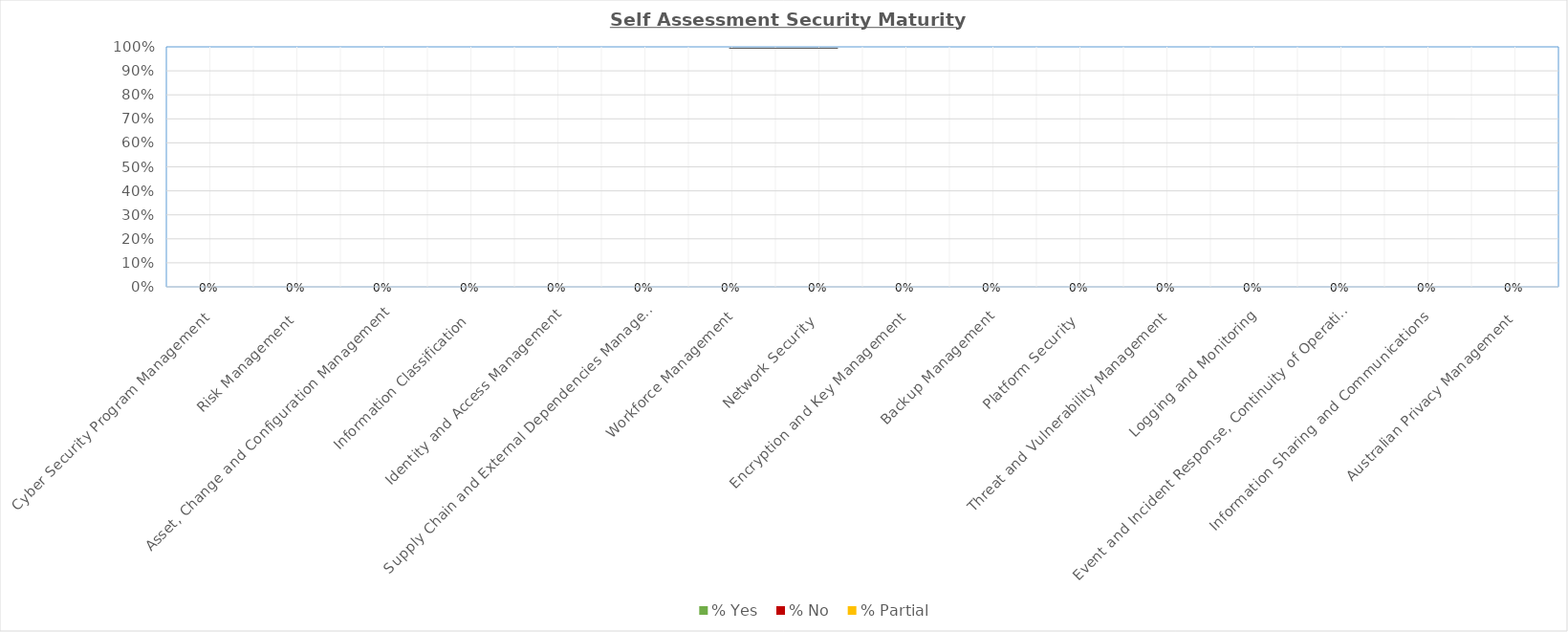
| Category | % Yes | % No | % Partial |
|---|---|---|---|
| Cyber Security Program Management | 0 | 0 | 0 |
| Risk Management | 0 | 0 | 0 |
| Asset, Change and Configuration Management | 0 | 0 | 0 |
| Information Classification | 0 | 0 | 0 |
| Identity and Access Management | 0 | 0 | 0 |
| Supply Chain and External Dependencies Management | 0 | 0 | 0 |
|  Workforce Management | 0 | 0 | 0 |
| Network Security | 0 | 0 | 0 |
| Encryption and Key Management | 0 | 0 | 0 |
| Backup Management | 0 | 0 | 0 |
| Platform Security | 0 | 0 | 0 |
| Threat and Vulnerability Management | 0 | 0 | 0 |
| Logging and Monitoring | 0 | 0 | 0 |
| Event and Incident Response, Continuity of Operations | 0 | 0 | 0 |
| Information Sharing and Communications | 0 | 0 | 0 |
| Australian Privacy Management | 0 | 0 | 0 |